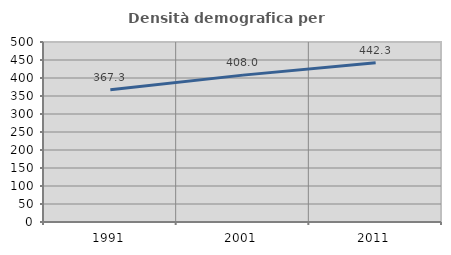
| Category | Densità demografica |
|---|---|
| 1991.0 | 367.267 |
| 2001.0 | 407.974 |
| 2011.0 | 442.305 |